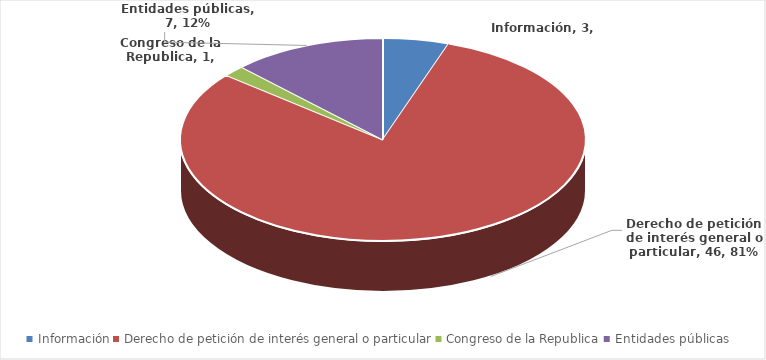
| Category | Series 0 |
|---|---|
| Información | 3 |
| Derecho de petición de interés general o particular | 46 |
| Congreso de la Republica | 1 |
| Entidades públicas | 7 |